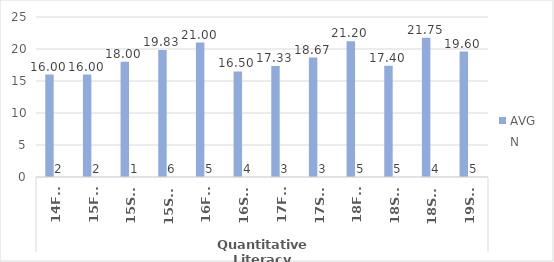
| Category | HS.AAS - AVG | HS.AAS - N |
|---|---|---|
| 0 | 16 | 2 |
| 1 | 16 | 2 |
| 2 | 18 | 1 |
| 3 | 19.833 | 6 |
| 4 | 21 | 5 |
| 5 | 16.5 | 4 |
| 6 | 17.333 | 3 |
| 7 | 18.667 | 3 |
| 8 | 21.2 | 5 |
| 9 | 17.4 | 5 |
| 10 | 21.75 | 4 |
| 11 | 19.6 | 5 |